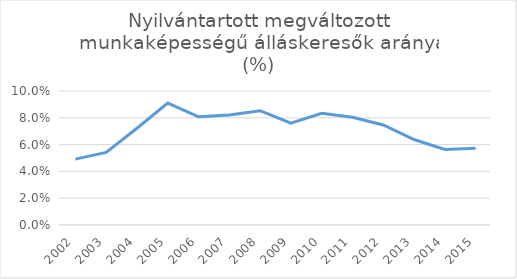
| Category | Nyilvántartott megváltozott munkaképességű álláskeresők aránya (%) |
|---|---|
| 2002.0 | 0.049 |
| 2003.0 | 0.054 |
| 2004.0 | 0.072 |
| 2005.0 | 0.091 |
| 2006.0 | 0.081 |
| 2007.0 | 0.082 |
| 2008.0 | 0.085 |
| 2009.0 | 0.076 |
| 2010.0 | 0.083 |
| 2011.0 | 0.08 |
| 2012.0 | 0.075 |
| 2013.0 | 0.064 |
| 2014.0 | 0.056 |
| 2015.0 | 0.057 |